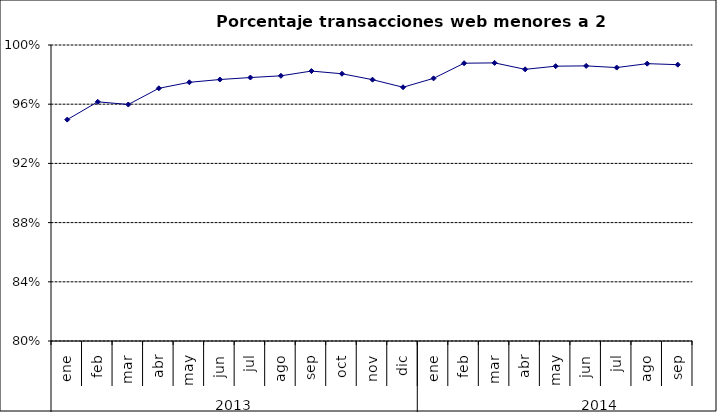
| Category | 94,96% 96,16% 95,98% 97,07% 97,48% 97,67% 97,80% 97,92% 98,24% 98,06% 97,66% 97,15% 97,75% 98,77% 98,79% 98,36% 98,57% 98,59% 98,48% 98,74% 98,67% |
|---|---|
| 0 | 0.95 |
| 1 | 0.962 |
| 2 | 0.96 |
| 3 | 0.971 |
| 4 | 0.975 |
| 5 | 0.977 |
| 6 | 0.978 |
| 7 | 0.979 |
| 8 | 0.982 |
| 9 | 0.981 |
| 10 | 0.977 |
| 11 | 0.971 |
| 12 | 0.977 |
| 13 | 0.988 |
| 14 | 0.988 |
| 15 | 0.984 |
| 16 | 0.986 |
| 17 | 0.986 |
| 18 | 0.985 |
| 19 | 0.987 |
| 20 | 0.987 |